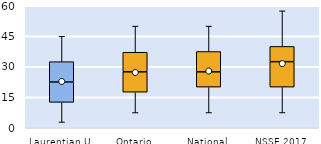
| Category | 25th | 50th | 75th |
|---|---|---|---|
| Laurentian U | 12.5 | 10 | 10 |
| Ontario | 17.5 | 10 | 9.643 |
| National | 20 | 7.5 | 10 |
| NSSE 2017 | 20 | 12.5 | 7.5 |